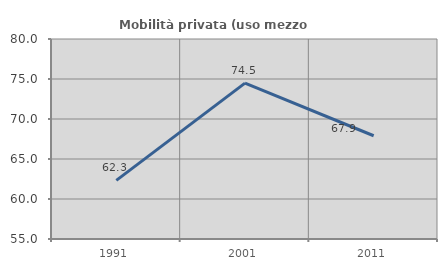
| Category | Mobilità privata (uso mezzo privato) |
|---|---|
| 1991.0 | 62.326 |
| 2001.0 | 74.491 |
| 2011.0 | 67.905 |